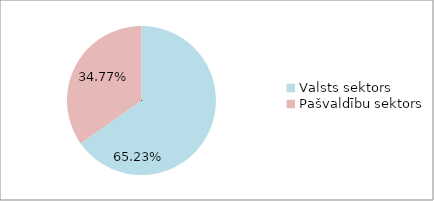
| Category | Series 0 |
|---|---|
| Valsts sektors | 0.652 |
| Pašvaldību sektors | 0.348 |